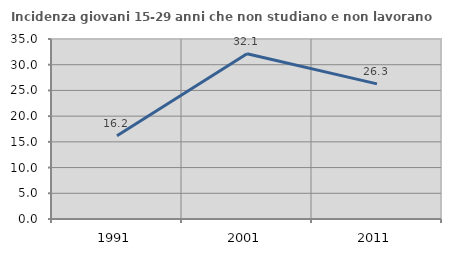
| Category | Incidenza giovani 15-29 anni che non studiano e non lavorano  |
|---|---|
| 1991.0 | 16.194 |
| 2001.0 | 32.128 |
| 2011.0 | 26.273 |